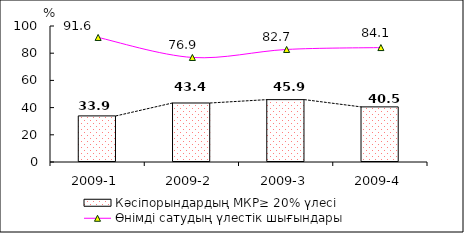
| Category | Кәсіпорындардың МКР≥ 20% үлесі |
|---|---|
| 2009-1 | 33.896 |
| 2009-2 | 43.392 |
| 2009-3 | 45.858 |
| 2009-4 | 40.531 |